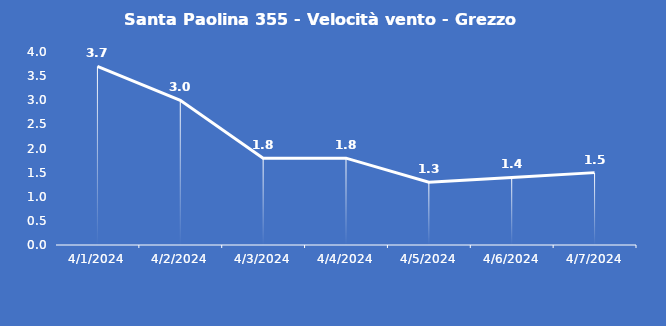
| Category | Santa Paolina 355 - Velocità vento - Grezzo (m/s) |
|---|---|
| 4/1/24 | 3.7 |
| 4/2/24 | 3 |
| 4/3/24 | 1.8 |
| 4/4/24 | 1.8 |
| 4/5/24 | 1.3 |
| 4/6/24 | 1.4 |
| 4/7/24 | 1.5 |